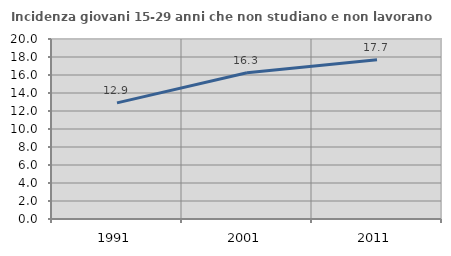
| Category | Incidenza giovani 15-29 anni che non studiano e non lavorano  |
|---|---|
| 1991.0 | 12.903 |
| 2001.0 | 16.258 |
| 2011.0 | 17.695 |